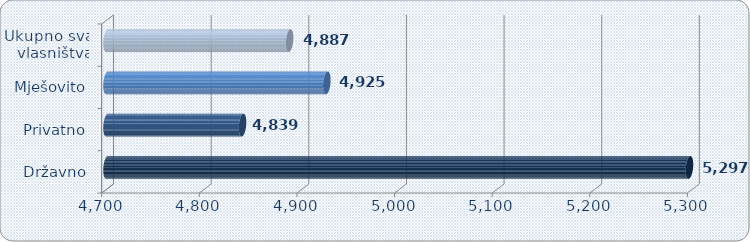
| Category | Prosječna mjesečna neto plaća po zaposlenom |
|---|---|
| Državno | 5296.61 |
| Privatno | 4838.864 |
| Mješovito | 4925.189 |
| Ukupno sva
 vlasništva | 4887.052 |